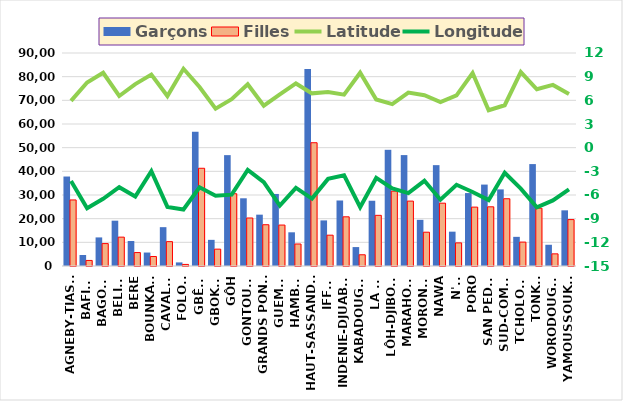
| Category | Garçons | Filles |
|---|---|---|
| AGNEBY-TIASSA | 37809 | 27913 |
| BAFING | 4654 | 2346 |
| BAGOUE | 12080 | 9468 |
| BELIER | 19149 | 12198 |
| BERE | 10554 | 5681 |
| BOUNKANI | 5690 | 4017 |
| CAVALLY | 16411 | 10299 |
| FOLON | 1517 | 662 |
| GBÊKÊ | 56676 | 41293 |
| GBOKLE | 11049 | 7119 |
| GÔH | 46845 | 30536 |
| GONTOUGO | 28612 | 20282 |
| GRANDS PONTS | 21694 | 17440 |
| GUEMON | 30438 | 17299 |
| HAMBOL | 14238 | 9301 |
| HAUT-SASSANDRA | 83225 | 52088 |
| IFFOU | 19265 | 13021 |
| INDENIE-DJUABLIN | 27680 | 20783 |
| KABADOUGOU | 7997 | 4743 |
| LA ME | 27572 | 21409 |
| LÔH-DJIBOUA | 49097 | 31613 |
| MARAHOUE | 46864 | 27419 |
| MORONOU | 19506 | 14277 |
| NAWA | 42615 | 26542 |
| N'ZI | 14508 | 9768 |
| PORO | 30816 | 24879 |
| SAN PEDRO | 34402 | 25010 |
| SUD-COMOE | 32367 | 28419 |
| TCHOLOGO | 12319 | 10098 |
| TONKPI | 43063 | 24408 |
| WORODOUGOU | 8971 | 5130 |
| YAMOUSSOUKRO | 23523 | 19610 |